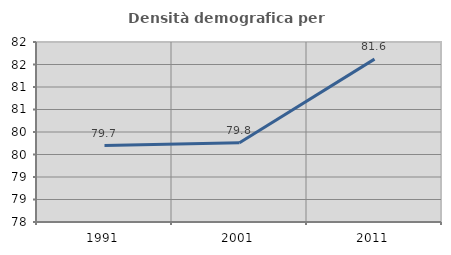
| Category | Densità demografica |
|---|---|
| 1991.0 | 79.699 |
| 2001.0 | 79.761 |
| 2011.0 | 81.619 |